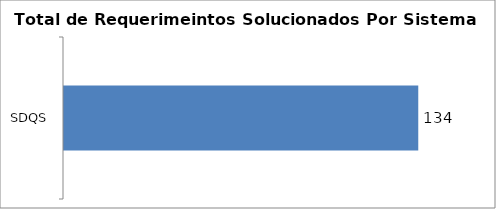
| Category | Total |
|---|---|
| SDQS | 134 |